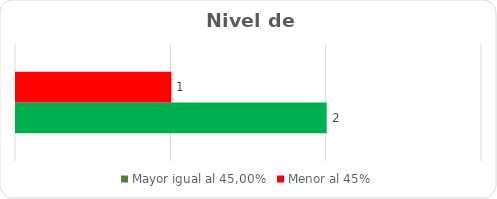
| Category | Mayor igual al 45,00% | Menor al 45% |
|---|---|---|
| 0 | 2 | 1 |